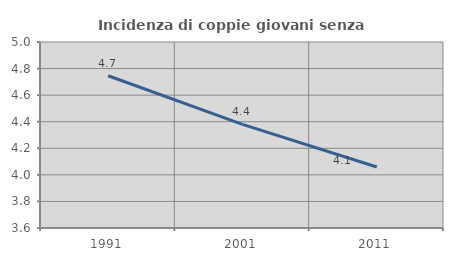
| Category | Incidenza di coppie giovani senza figli |
|---|---|
| 1991.0 | 4.746 |
| 2001.0 | 4.38 |
| 2011.0 | 4.059 |